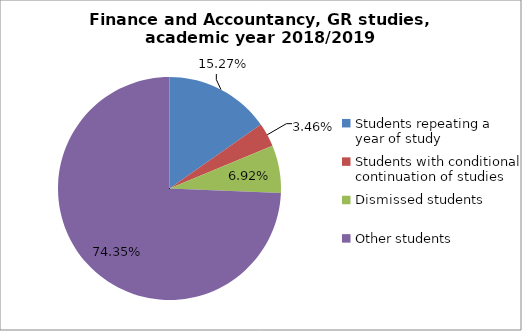
| Category | Series 0 |
|---|---|
| Students repeating a year of study | 53 |
| Students with conditional continuation of studies | 12 |
| Dismissed students | 24 |
| Other students | 258 |